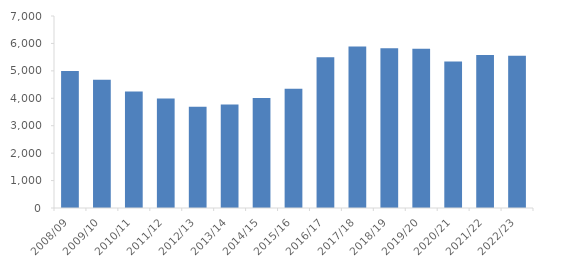
| Category | Iscritti serali |
|---|---|
| 2008/09 | 4999 |
| 2009/10 | 4675 |
| 2010/11 | 4245 |
| 2011/12 | 3996 |
| 2012/13 | 3693 |
| 2013/14 | 3774 |
| 2014/15 | 4006 |
| 2015/16 | 4346 |
| 2016/17 | 5495 |
| 2017/18 | 5888 |
| 2018/19 | 5821 |
| 2019/20 | 5803 |
| 2020/21 | 5345 |
| 2021/22 | 5582 |
| 2022/23 | 5554 |